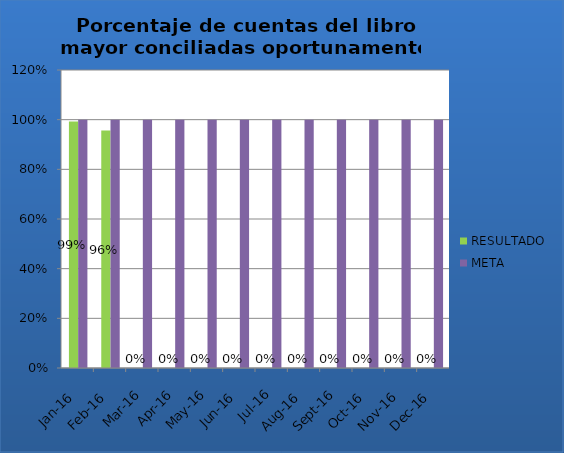
| Category | RESULTADO | META |
|---|---|---|
| ene-16 | 0.993 | 1 |
| feb-16 | 0.956 | 1 |
| mar-16 | 0 | 1 |
| abr-16 | 0 | 1 |
| may-16 | 0 | 1 |
| jun-16 | 0 | 1 |
| jul-16 | 0 | 1 |
| ago-16 | 0 | 1 |
| sep-16 | 0 | 1 |
| oct-16 | 0 | 1 |
| nov-16 | 0 | 1 |
| dic-16 | 0 | 1 |